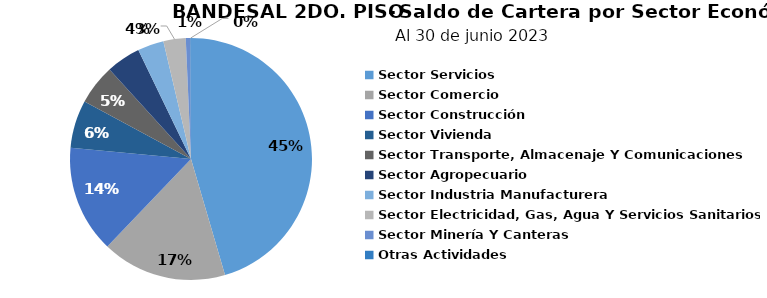
| Category | Saldo |
|---|---|
| Sector Servicios | 206.867 |
| Sector Comercio | 75.914 |
| Sector Construcción | 65.211 |
| Sector Vivienda | 29.041 |
| Sector Transporte, Almacenaje Y Comunicaciones | 24.46 |
| Sector Agropecuario | 20.873 |
| Sector Industria Manufacturera | 15.932 |
| Sector Electricidad, Gas, Agua Y Servicios Sanitarios | 13.539 |
| Sector Minería Y Canteras | 2.775 |
| Otras Actividades | 0.373 |